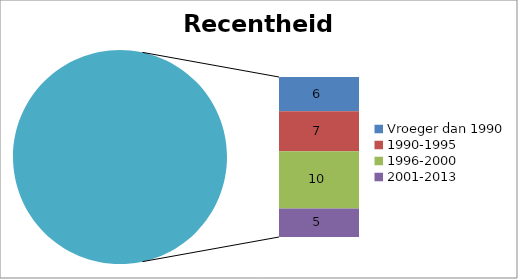
| Category | Series 0 |
|---|---|
| Vroeger dan 1990 | 6 |
| 1990-1995 | 7 |
| 1996-2000 | 10 |
| 2001-2013 | 5 |